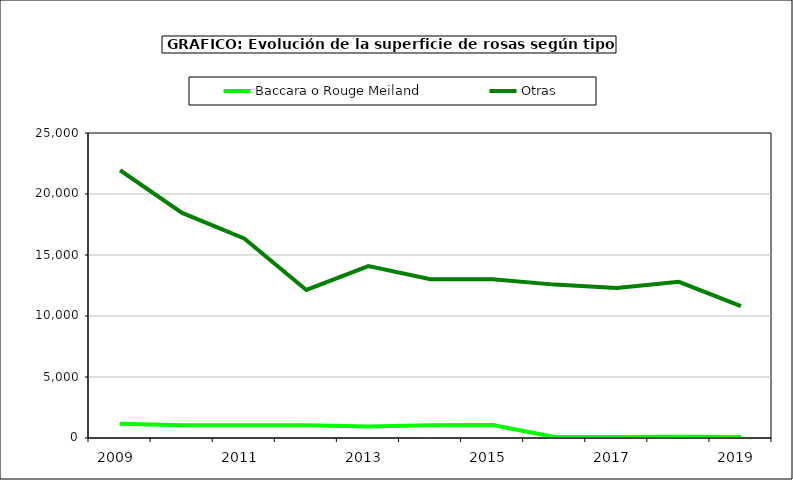
| Category | Baccara o Rouge Meiland | Otras |
|---|---|---|
| 2009.0 | 1160 | 21945 |
| 2010.0 | 1050 | 18446 |
| 2011.0 | 1050 | 16360 |
| 2012.0 | 1050 | 12133 |
| 2013.0 | 950 | 14093 |
| 2014.0 | 1050 | 13013 |
| 2015.0 | 1070 | 13016 |
| 2016.0 | 79 | 12572 |
| 2017.0 | 79 | 12292 |
| 2018.0 | 93 | 12802 |
| 2019.0 | 91 | 10801 |